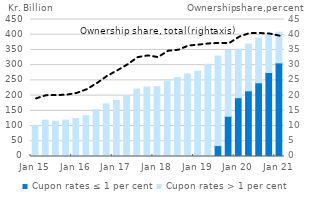
| Category | Cupon rates ≤ 1 per cent | Cupon rates > 1 per cent |
|---|---|---|
| Jan 15 | 0 | 102.402 |
| Apr 15 | 0 | 119.351 |
| Jul 15 | 0 | 115.792 |
| Okt 15 | 0 | 119.267 |
| Jan 16 | 0 | 124.867 |
| Apr 16 | 0 | 134.277 |
| Jul 16 | 0 | 153.595 |
| Okt 16 | 0 | 173.032 |
| Jan 17 | 0 | 184.435 |
| Apr 17 | 0 | 199.746 |
| Jul 17 | 0 | 221.579 |
| Okt 17 | 0 | 228.177 |
| Jan 18 | 0 | 229.387 |
| Apr 18 | 0 | 248.479 |
| Jul 18 | 0 | 259.844 |
| Okt 18 | 0 | 271.239 |
| Jan 19 | 0 | 280.561 |
| Apr 19 | 0.008 | 302.862 |
| Jul 19 | 35.996 | 293.835 |
| Okt 19 | 132.273 | 216.598 |
| Jan 20 | 193.111 | 159.314 |
| Apr 20 | 215.741 | 153.487 |
| Jul 20 | 242.086 | 147.213 |
| Okt 20 | 275.864 | 125.321 |
| Jan 21 | 307.456 | 100.733 |